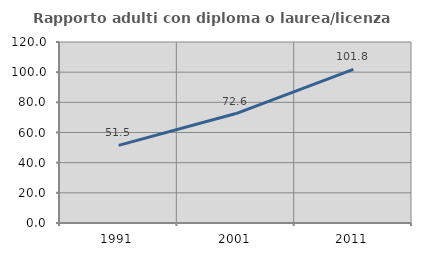
| Category | Rapporto adulti con diploma o laurea/licenza media  |
|---|---|
| 1991.0 | 51.497 |
| 2001.0 | 72.558 |
| 2011.0 | 101.794 |